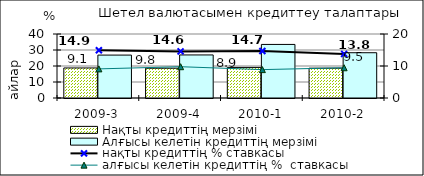
| Category | Нақты кредиттің мерзімі  | Алғысы келетін кредиттің мерзімі  |
|---|---|---|
| 2009-3 | 18.77 | 26.82 |
| 2009-4 | 18.61 | 26.91 |
| 2010-1 | 19.11 | 33.48 |
| 2010-2 | 18.64 | 28.3 |